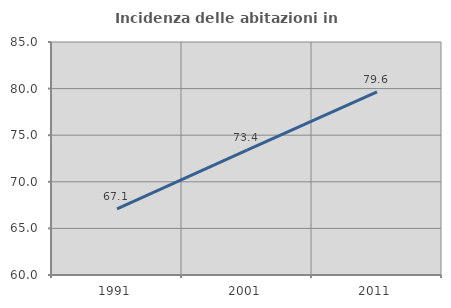
| Category | Incidenza delle abitazioni in proprietà  |
|---|---|
| 1991.0 | 67.105 |
| 2001.0 | 73.391 |
| 2011.0 | 79.646 |